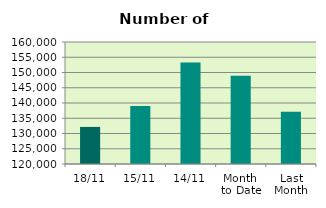
| Category | Series 0 |
|---|---|
| 18/11 | 132154 |
| 15/11 | 139044 |
| 14/11 | 153266 |
| Month 
to Date | 148909.667 |
| Last
Month | 137122.087 |